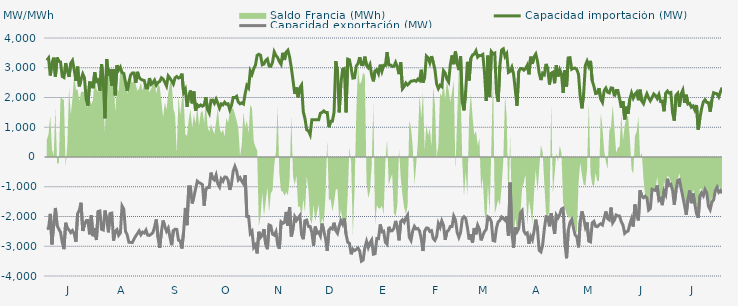
| Category | Capacidad importación (MW) | Capacidad exportación (MW) |
|---|---|---|
| 0 | 3248.625 | -2416.417 |
| 1900-01-01 | 3327.583 | -2395.083 |
| 1900-01-02 | 2740.958 | -1910.417 |
| 1900-01-03 | 3160.083 | -2937.917 |
| 1900-01-04 | 3339 | -2237.833 |
| 1900-01-05 | 2697.208 | -1712.5 |
| 1900-01-06 | 3342.917 | -2305.083 |
| 1900-01-07 | 3218 | -2421.583 |
| 1900-01-08 | 3194.333 | -2530.333 |
| 1900-01-09 | 2706.458 | -2869.083 |
| 1900-01-10 | 2673 | -3096.5 |
| 1900-01-11 | 3156.5 | -2212.083 |
| 1900-01-12 | 2884.958 | -2401.708 |
| 1900-01-13 | 2692.292 | -2450.833 |
| 1900-01-14 | 3152.125 | -2539.5 |
| 1900-01-15 | 3244.042 | -2473.208 |
| 1900-01-16 | 2930.458 | -2581.292 |
| 1900-01-17 | 2559.833 | -2848.708 |
| 1900-01-18 | 3037.583 | -1901.417 |
| 1900-01-19 | 2375 | -1787.5 |
| 1900-01-20 | 2608.75 | -1537.5 |
| 1900-01-21 | 2790.667 | -2487.458 |
| 1900-01-22 | 2656.542 | -2277.167 |
| 1900-01-23 | 1950.833 | -2138.208 |
| 1900-01-24 | 1725 | -2133.333 |
| 1900-01-25 | 2500 | -2600 |
| 1900-01-26 | 2493.5 | -1964.583 |
| 1900-01-27 | 2311.125 | -2662.542 |
| 1900-01-28 | 2848.5 | -2386.333 |
| 1900-01-29 | 2541.5 | -2790.625 |
| 1900-01-30 | 2586.083 | -1829.542 |
| 1900-01-31 | 2229.167 | -1813.75 |
| 1900-02-01 | 3118.458 | -2430.875 |
| 1900-02-02 | 2560.5 | -2453.333 |
| 1900-02-03 | 1300 | -1800 |
| 1900-02-04 | 3293.208 | -2107.333 |
| 1900-02-05 | 2732.333 | -2531.667 |
| 1900-02-06 | 2958.208 | -1899.667 |
| 1900-02-07 | 2400 | -1885.417 |
| 1900-02-08 | 2949.792 | -2809.042 |
| 1900-02-09 | 2072.292 | -2500 |
| 1900-02-10 | 3083.958 | -2440.167 |
| 1900-02-11 | 2921.208 | -2632.667 |
| 1900-02-12 | 3017.667 | -2556.542 |
| 1900-02-13 | 2833.833 | -1646.083 |
| 1900-02-14 | 2807.833 | -1750 |
| 1900-02-15 | 2510.417 | -2496.792 |
| 1900-02-16 | 2220.833 | -2618.625 |
| 1900-02-17 | 2512.5 | -2867.042 |
| 1900-02-18 | 2756.375 | -2870.75 |
| 1900-02-19 | 2821.542 | -2876.667 |
| 1900-02-20 | 2821.833 | -2755.625 |
| 1900-02-21 | 2490.292 | -2656.833 |
| 1900-02-22 | 2862.667 | -2571.458 |
| 1900-02-23 | 2663.042 | -2482.25 |
| 1900-02-24 | 2613.625 | -2612.792 |
| 1900-02-25 | 2585.667 | -2523.458 |
| 1900-02-26 | 2571.292 | -2556.167 |
| 1900-02-27 | 2320.458 | -2456.542 |
| 1900-02-28 | 2316.542 | -2627.667 |
| 1900-02-28 | 2652.5 | -2635.708 |
| 1900-03-01 | 2442.625 | -2594.208 |
| 1900-03-02 | 2493.458 | -2546.125 |
| 1900-03-03 | 2582.917 | -2351.208 |
| 1900-03-04 | 2416.667 | -2100 |
| 1900-03-05 | 2504.5 | -2703.167 |
| 1900-03-06 | 2536.625 | -3052.25 |
| 1900-03-07 | 2662.208 | -2510.833 |
| 1900-03-08 | 2620.667 | -2134.75 |
| 1900-03-09 | 2511.833 | -2330.583 |
| 1900-03-10 | 2387.333 | -2494.25 |
| 1900-03-11 | 2724.583 | -2389 |
| 1900-03-12 | 2648.667 | -2691.542 |
| 1900-03-13 | 2557.292 | -2961.542 |
| 1900-03-14 | 2454.083 | -2472.25 |
| 1900-03-15 | 2661.417 | -2427.292 |
| 1900-03-16 | 2704.833 | -2434.167 |
| 1900-03-17 | 2653.75 | -2795.833 |
| 1900-03-18 | 2673.75 | -2822.875 |
| 1900-03-19 | 2800.917 | -3075.208 |
| 1900-03-20 | 2164.417 | -2510.625 |
| 1900-03-21 | 2270.833 | -1713.542 |
| 1900-03-22 | 1687.5 | -2291.667 |
| 1900-03-23 | 2066.667 | -1000 |
| 1900-03-24 | 2233.333 | -1000 |
| 1900-03-25 | 1804.167 | -1561.333 |
| 1900-03-26 | 2201.833 | -1341.667 |
| 1900-03-27 | 1556.25 | -1070.833 |
| 1900-03-28 | 1756.25 | -812.5 |
| 1900-03-29 | 1700 | -864.583 |
| 1900-03-30 | 1750 | -885.417 |
| 1900-03-31 | 1708.333 | -929.167 |
| 1900-04-01 | 1743.75 | -1636.25 |
| 1900-04-02 | 2008.083 | -1077.083 |
| 1900-04-03 | 1602.083 | -1020.833 |
| 1900-04-04 | 1479.167 | -1022.917 |
| 1900-04-05 | 1910.417 | -525 |
| 1900-04-06 | 1912.5 | -727.083 |
| 1900-04-07 | 1804.167 | -775 |
| 1900-04-08 | 1945.833 | -608.333 |
| 1900-04-09 | 1808.333 | -904.167 |
| 1900-04-10 | 1641.667 | -1006.25 |
| 1900-04-11 | 1785.417 | -735.417 |
| 1900-04-12 | 1752.083 | -812.5 |
| 1900-04-13 | 1841.667 | -675 |
| 1900-04-14 | 1772.917 | -677.083 |
| 1900-04-15 | 1788 | -777.083 |
| 1900-04-16 | 1587.5 | -1104.167 |
| 1900-04-17 | 1737.5 | -900 |
| 1900-04-18 | 1997.917 | -475 |
| 1900-04-19 | 1995.833 | -316.667 |
| 1900-04-20 | 2041.667 | -468.75 |
| 1900-04-21 | 1843.75 | -766.667 |
| 1900-04-22 | 1787.5 | -695.833 |
| 1900-04-23 | 1820.833 | -808.333 |
| 1900-04-24 | 1781.25 | -900 |
| 1900-04-25 | 2126.667 | -608.333 |
| 1900-04-26 | 2404.417 | -2000 |
| 1900-04-27 | 2323.167 | -2000 |
| 1900-04-28 | 2893.583 | -2571.5 |
| 1900-04-29 | 2778.083 | -2500.25 |
| 1900-04-30 | 2965.5 | -3038.667 |
| 1900-05-01 | 3083.64 | -2955.48 |
| 1900-05-02 | 3418.208 | -3238.958 |
| 1900-05-03 | 3452.875 | -2513.333 |
| 1900-05-04 | 3420.292 | -2703.208 |
| 1900-05-05 | 3100.083 | -2630.333 |
| 1900-05-06 | 3123.375 | -2422.458 |
| 1900-05-07 | 3242.792 | -2928.833 |
| 1900-05-08 | 3294.958 | -3098.417 |
| 1900-05-09 | 3054.042 | -2285.333 |
| 1900-05-10 | 3047.542 | -2315.25 |
| 1900-05-11 | 3179.458 | -2592.333 |
| 1900-05-12 | 3533.833 | -2627.792 |
| 1900-05-13 | 3414 | -2509.75 |
| 1900-05-14 | 3340.25 | -2944.208 |
| 1900-05-15 | 3208.208 | -3084.875 |
| 1900-05-16 | 3116.333 | -2180.292 |
| 1900-05-17 | 3502.875 | -2231.333 |
| 1900-05-18 | 3262.542 | -2201.667 |
| 1900-05-19 | 3524.167 | -1845.708 |
| 1900-05-20 | 3589.042 | -2314 |
| 1900-05-21 | 3358.375 | -1684.042 |
| 1900-05-22 | 3002 | -2672.375 |
| 1900-05-23 | 2567.583 | -2409.375 |
| 1900-05-24 | 2121 | -2013.417 |
| 1900-05-25 | 2334.5 | -2132.333 |
| 1900-05-26 | 2006.833 | -2047.042 |
| 1900-05-27 | 2325 | -1968.542 |
| 1900-05-28 | 2420.75 | -2611.292 |
| 1900-05-29 | 1517.25 | -2763 |
| 1900-05-30 | 1283.917 | -2141.667 |
| 1900-05-31 | 916.417 | -2120.833 |
| 1900-06-01 | 879.167 | -2332.417 |
| 1900-06-02 | 750 | -2334.958 |
| 1900-06-03 | 1250 | -2536 |
| 1900-06-04 | 1250 | -2982 |
| 1900-06-05 | 1250 | -2338.583 |
| 1900-06-06 | 1250 | -2558.333 |
| 1900-06-07 | 1250 | -2526.375 |
| 1900-06-08 | 1470.833 | -2652.25 |
| 1900-06-09 | 1500 | -2239.292 |
| 1900-06-10 | 1550 | -2486.75 |
| 1900-06-11 | 1500 | -2733.5 |
| 1900-06-12 | 1500 | -3155.125 |
| 1900-06-13 | 1000 | -2458.542 |
| 1900-06-14 | 1200 | -2385.25 |
| 1900-06-15 | 1200 | -2419 |
| 1900-06-16 | 1500 | -2208.75 |
| 1900-06-17 | 3221.708 | -2468.625 |
| 1900-06-18 | 2881.375 | -2561.25 |
| 1900-06-19 | 1500 | -2320.833 |
| 1900-06-20 | 2479.75 | -2136.875 |
| 1900-06-21 | 2947.875 | -2253.917 |
| 1900-06-22 | 2974.833 | -2068.75 |
| 1900-06-23 | 1500 | -2595.083 |
| 1900-06-24 | 3289.208 | -2867.583 |
| 1900-06-25 | 3267.875 | -2898.625 |
| 1900-06-26 | 2979.083 | -3270.083 |
| 1900-06-27 | 2652.375 | -3097.333 |
| 1900-06-28 | 2663.208 | -3144.542 |
| 1900-06-29 | 3058.292 | -3107.917 |
| 1900-06-30 | 3141.958 | -3054.292 |
| 1900-07-01 | 3354.667 | -3163.833 |
| 1900-07-02 | 3106.083 | -3500.875 |
| 1900-07-03 | 3099.042 | -3464.417 |
| 1900-07-04 | 3374.208 | -3046.25 |
| 1900-07-05 | 3081.083 | -2836.417 |
| 1900-07-06 | 3002 | -3040.417 |
| 1900-07-07 | 3113.875 | -2884.417 |
| 1900-07-08 | 2746.792 | -2789.333 |
| 1900-07-09 | 2544 | -3266.167 |
| 1900-07-10 | 2896.458 | -3250.667 |
| 1900-07-11 | 2937 | -2740.375 |
| 1900-07-12 | 2803.458 | -2745 |
| 1900-07-13 | 3104.125 | -2267.833 |
| 1900-07-14 | 2884.333 | -2514.583 |
| 1900-07-15 | 3081.042 | -2493.458 |
| 1900-07-16 | 3079.083 | -2866 |
| 1900-07-17 | 3524.292 | -2932.083 |
| 1900-07-18 | 3096.5 | -2347.083 |
| 1900-07-19 | 3096.5 | -2484.875 |
| 1900-07-20 | 3044.417 | -2478.583 |
| 1900-07-21 | 3048.167 | -2403.5 |
| 1900-07-22 | 3181.083 | -2147.542 |
| 1900-07-23 | 3030.708 | -2365.833 |
| 1900-07-24 | 2784.5 | -2801.333 |
| 1900-07-25 | 3182.417 | -2165.083 |
| 1900-07-26 | 2292.583 | -2110.5 |
| 1900-07-27 | 2370.25 | -2192.75 |
| 1900-07-28 | 2487.208 | -2051.417 |
| 1900-07-29 | 2421.292 | -1952.083 |
| 1900-07-30 | 2482.917 | -2699.375 |
| 1900-07-31 | 2548.458 | -2805.375 |
| 1900-08-01 | 2554.458 | -2484.042 |
| 1900-08-02 | 2574.083 | -2331.417 |
| 1900-08-03 | 2544.458 | -2417.833 |
| 1900-08-04 | 2615.833 | -2403.25 |
| 1900-08-05 | 2568.917 | -2488.625 |
| 1900-08-06 | 2932.208 | -2748.875 |
| 1900-08-07 | 2500.875 | -3160.125 |
| 1900-08-08 | 2689.458 | -2491.667 |
| 1900-08-09 | 3392.292 | -2386.5 |
| 1900-08-10 | 3335.083 | -2392.75 |
| 1900-08-11 | 3167.5 | -2500.5 |
| 1900-08-12 | 3390.625 | -2475.917 |
| 1900-08-13 | 3180.958 | -2741.75 |
| 1900-08-14 | 2936.5 | -2801.625 |
| 1900-08-15 | 2452.792 | -2674.667 |
| 1900-08-16 | 2300.208 | -2235.25 |
| 1900-08-17 | 2411.792 | -2365.167 |
| 1900-08-18 | 2366.75 | -2147.917 |
| 1900-08-19 | 2902.042 | -2292.875 |
| 1900-08-20 | 2822.25 | -2784.375 |
| 1900-08-21 | 2619.333 | -2505.792 |
| 1900-08-22 | 2523.292 | -2462.542 |
| 1900-08-23 | 3101.75 | -2337.5 |
| 1900-08-24 | 3414.042 | -2335.5 |
| 1900-08-25 | 3119.417 | -1987.458 |
| 1900-08-26 | 3547.333 | -2114.583 |
| 1900-08-27 | 3135.708 | -2530.042 |
| 1900-08-28 | 2921.125 | -2699.333 |
| 1900-08-29 | 3380.917 | -2535.75 |
| 1900-08-30 | 1842.042 | -2078.542 |
| 1900-08-31 | 1566.833 | -2010.417 |
| 1900-09-01 | 2214.542 | -2066.667 |
| 1900-09-02 | 3198.583 | -2370 |
| 1900-09-03 | 2574 | -2772.958 |
| 1900-09-04 | 3310.583 | -2592.083 |
| 1900-09-05 | 3430.75 | -2875.542 |
| 1900-09-06 | 3458.333 | -2387.75 |
| 1900-09-07 | 3568.125 | -2599.208 |
| 1900-09-08 | 3355.708 | -2294.333 |
| 1900-09-09 | 3414.333 | -2427 |
| 1900-09-10 | 3410.542 | -2802.125 |
| 1900-09-11 | 3447.375 | -2640.958 |
| 1900-09-12 | 2831.208 | -2506.667 |
| 1900-09-13 | 1881.583 | -2434.25 |
| 1900-09-14 | 3406.708 | -2011.583 |
| 1900-09-15 | 2022.5 | -2050 |
| 1900-09-16 | 3540.875 | -2176.417 |
| 1900-09-17 | 3466.542 | -2807.167 |
| 1900-09-18 | 3493.375 | -2823.167 |
| 1900-09-19 | 2166.833 | -2382.125 |
| 1900-09-20 | 1859.958 | -2177.167 |
| 1900-09-21 | 3077.875 | -2132.833 |
| 1900-09-22 | 3595.75 | -2015.417 |
| 1900-09-23 | 3634.375 | -2069.417 |
| 1900-09-24 | 3379.833 | -2125 |
| 1900-09-25 | 3470.304 | -1991.957 |
| 1900-09-26 | 2844 | -2641.708 |
| 1900-09-27 | 2880.625 | -862.5 |
| 1900-09-28 | 3017.208 | -2558.208 |
| 1900-09-29 | 2787.708 | -3047.042 |
| 1900-09-30 | 2256.625 | -2365.667 |
| 1900-10-01 | 1722.917 | -2515.917 |
| 1900-10-02 | 2869 | -2405.667 |
| 1900-10-03 | 2973.167 | -1879.167 |
| 1900-10-04 | 2971 | -1806.25 |
| 1900-10-05 | 2919.208 | -2484.833 |
| 1900-10-06 | 2973.125 | -2583.917 |
| 1900-10-07 | 3083.25 | -2551.375 |
| 1900-10-08 | 2777.875 | -2917.292 |
| 1900-10-09 | 3371.833 | -2672.292 |
| 1900-10-10 | 3131 | -2785.25 |
| 1900-10-11 | 3368.375 | -2480.958 |
| 1900-10-12 | 3462.292 | -2105.333 |
| 1900-10-13 | 3215.917 | -2442.958 |
| 1900-10-14 | 2817.875 | -3136.917 |
| 1900-10-15 | 2586 | -3188.792 |
| 1900-10-16 | 2815 | -2954.042 |
| 1900-10-17 | 2767 | -2418.75 |
| 1900-10-18 | 3129.208 | -2005 |
| 1900-10-19 | 2953.792 | -2013.417 |
| 1900-10-20 | 2437.083 | -2329.833 |
| 1900-10-21 | 2815.958 | -1889.333 |
| 1900-10-22 | 2849.708 | -2257.667 |
| 1900-10-23 | 2479.208 | -2586.833 |
| 1900-10-24 | 3084.333 | -1954.5 |
| 1900-10-25 | 2707.042 | -2046.583 |
| 1900-10-26 | 2933.542 | -1941.667 |
| 1900-10-27 | 2795.917 | -1750 |
| 1900-10-28 | 2158.042 | -1718.75 |
| 1900-10-29 | 2918.875 | -2898.083 |
| 1900-10-30 | 2368.375 | -3404.167 |
| 1900-10-31 | 3329.75 | -2465.083 |
| 1900-11-01 | 3339.208 | -2197.25 |
| 1900-11-02 | 2948.5 | -2100.583 |
| 1900-11-03 | 2980.792 | -2371.042 |
| 1900-11-04 | 2990.708 | -2620.708 |
| 1900-11-05 | 2938.333 | -2683 |
| 1900-11-06 | 2774.542 | -3036.75 |
| 1900-11-07 | 2014.917 | -2156.292 |
| 1900-11-08 | 1635.417 | -1825.292 |
| 1900-11-09 | 2140.25 | -2060.75 |
| 1900-11-10 | 3080.917 | -2353.125 |
| 1900-11-11 | 3223.333 | -2199.083 |
| 1900-11-12 | 3058.083 | -2827.667 |
| 1900-11-13 | 3231.167 | -2853.292 |
| 1900-11-14 | 2562 | -2213.625 |
| 1900-11-15 | 2375 | -2164.25 |
| 1900-11-16 | 2133.333 | -2329.5 |
| 1900-11-17 | 2150 | -2341.083 |
| 1900-11-18 | 2314.583 | -2282 |
| 1900-11-19 | 1943.75 | -2242.25 |
| 1900-11-20 | 1835.625 | -2285.208 |
| 1900-11-21 | 2235.417 | -2055.542 |
| 1900-11-22 | 2316.667 | -1831.25 |
| 1900-11-23 | 2178.125 | -2071.583 |
| 1900-11-24 | 2154.167 | -2116.125 |
| 1900-11-25 | 2321.417 | -1699.458 |
| 1900-11-26 | 2312 | -2210.167 |
| 1900-11-27 | 2040.917 | -2118.083 |
| 1900-11-28 | 2233.083 | -1949.458 |
| 1900-11-29 | 2234.854 | -1977.083 |
| 1900-11-30 | 1964.583 | -1985.792 |
| 1900-12-01 | 1650 | -2177.417 |
| 1900-12-02 | 1877.083 | -2287.667 |
| 1900-12-03 | 1264.583 | -2568.708 |
| 1900-12-04 | 1691.667 | -2512.667 |
| 1900-12-05 | 1456.25 | -2486.333 |
| 1900-12-06 | 1945.833 | -2259.083 |
| 1900-12-07 | 2154.167 | -2079.5 |
| 1900-12-08 | 1979.167 | -2336.083 |
| 1900-12-09 | 2104.167 | -1597.917 |
| 1900-12-10 | 2179.167 | -1954.167 |
| 1900-12-11 | 1908.333 | -2131.25 |
| 1900-12-12 | 2262.5 | -1118.75 |
| 1900-12-13 | 1879.167 | -1314.583 |
| 1900-12-14 | 1791.667 | -1368 |
| 1900-12-15 | 1977.083 | -1316.667 |
| 1900-12-16 | 2127.083 | -1377.083 |
| 1900-12-17 | 1987.5 | -1785.417 |
| 1900-12-18 | 1887.5 | -1733.333 |
| 1900-12-19 | 2002.083 | -1085.417 |
| 1900-12-20 | 2118.75 | -1110.417 |
| 1900-12-21 | 2066.667 | -1125 |
| 1900-12-22 | 1966.667 | -958.333 |
| 1900-12-23 | 2097.917 | -1454.167 |
| 1900-12-24 | 1864.583 | -1397.917 |
| 1900-12-25 | 1877.083 | -1618.75 |
| 1900-12-26 | 1537.5 | -1143.75 |
| 1900-12-27 | 2145.833 | -1264 |
| 1900-12-28 | 2216.667 | -731.25 |
| 1900-12-29 | 2150 | -950 |
| 1900-12-30 | 2167.583 | -916.667 |
| 1900-12-31 | 1493.75 | -1122.25 |
| 1901-01-01 | 1220.833 | -1604.167 |
| 1901-01-02 | 2072.917 | -1125 |
| 1901-01-03 | 2139.583 | -791.667 |
| 1901-01-04 | 1687.5 | -764.583 |
| 1901-01-05 | 2116.667 | -1058.333 |
| 1901-01-06 | 2247.917 | -1337.5 |
| 1901-01-07 | 1818.75 | -1627.083 |
| 1901-01-08 | 2093.75 | -1937.5 |
| 1901-01-09 | 1781.25 | -1422.917 |
| 1901-01-10 | 1804.167 | -1127.083 |
| 1901-01-11 | 1675 | -1552.083 |
| 1901-01-12 | 1716.667 | -1225 |
| 1901-01-13 | 1583.333 | -1570.833 |
| 1901-01-14 | 1747.917 | -1904.167 |
| 1901-01-15 | 918.75 | -2042.875 |
| 1901-01-16 | 1314.583 | -1310.417 |
| 1901-01-17 | 1629.167 | -1200 |
| 1901-01-18 | 1852.083 | -1300.583 |
| 1901-01-19 | 1925 | -1095.833 |
| 1901-01-20 | 1835.417 | -1208.333 |
| 1901-01-21 | 1827.083 | -1656.25 |
| 1901-01-22 | 1522.917 | -1770.917 |
| 1901-01-23 | 1916.667 | -1518.75 |
| 1901-01-24 | 2160.417 | -1441.667 |
| 1901-01-25 | 2139.583 | -1137.5 |
| 1901-01-26 | 2120.833 | -1018.75 |
| 1901-01-27 | 2018.75 | -1183.333 |
| 1901-01-28 | 2193.75 | -1127.083 |
| 1901-01-29 | 2333.333 | -1220.833 |